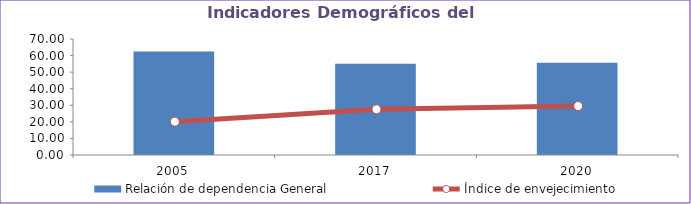
| Category | Relación de dependencia General |
|---|---|
| 2005.0 | 62.429 |
| 2017.0 | 55.026 |
| 2020.0 | 55.714 |